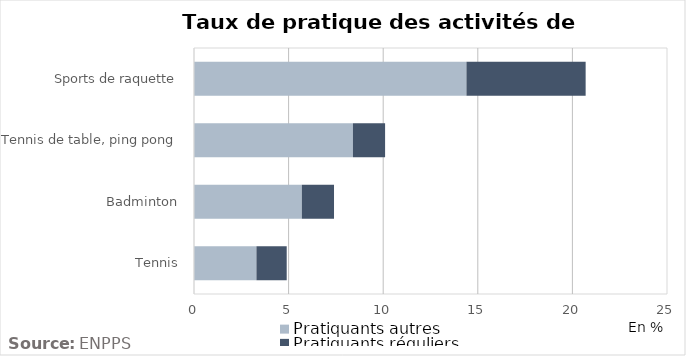
| Category | Pratiquants autres | Pratiquants réguliers |
|---|---|---|
| Tennis | 3.3 | 1.6 |
| Badminton | 5.7 | 1.7 |
| Tennis de table, ping pong | 8.4 | 1.7 |
| Sports de raquette | 14.4 | 6.3 |